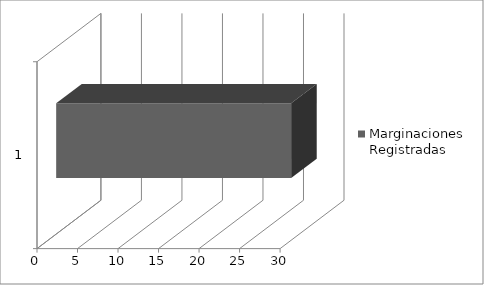
| Category | Marginaciones Registradas |
|---|---|
| 0 | 29 |